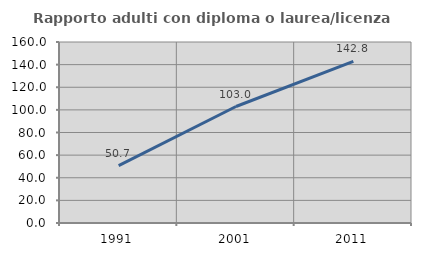
| Category | Rapporto adulti con diploma o laurea/licenza media  |
|---|---|
| 1991.0 | 50.698 |
| 2001.0 | 102.97 |
| 2011.0 | 142.82 |